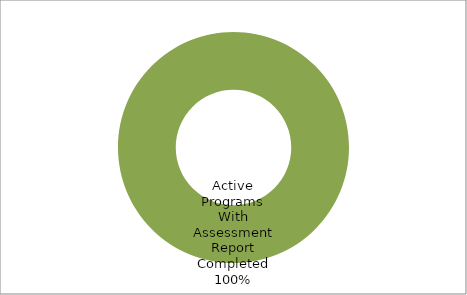
| Category | Series 0 |
|---|---|
| Active Programs With Assessment Report Completed | 35 |
| Active Programs Without Assessment Report | 0 |